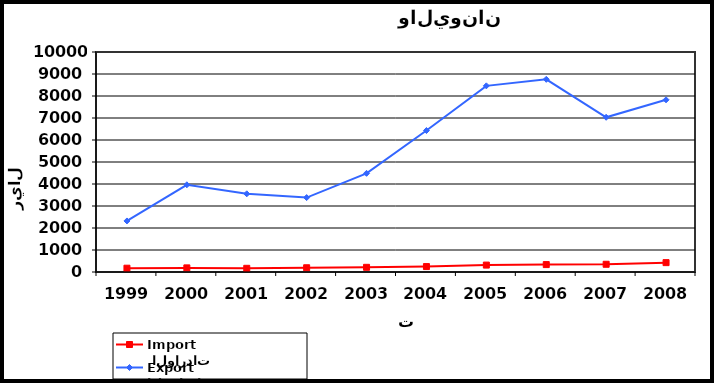
| Category |  الواردات           Import | الصادرات          Export |
|---|---|---|
| 1999.0 | 173 | 2321 |
| 2000.0 | 187 | 3964 |
| 2001.0 | 168 | 3554 |
| 2002.0 | 193 | 3382 |
| 2003.0 | 213 | 4485 |
| 2004.0 | 247 | 6430 |
| 2005.0 | 314 | 8461 |
| 2006.0 | 337 | 8758 |
| 2007.0 | 351 | 7032 |
| 2008.0 | 426 | 7827 |